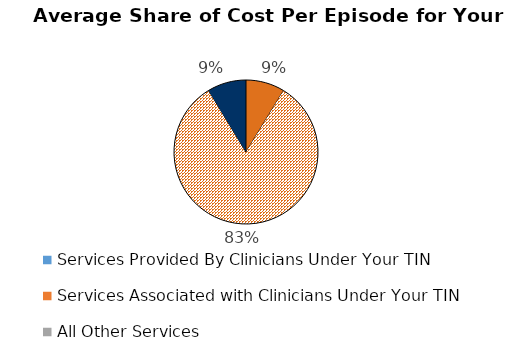
| Category | Series 2 | Series 3 | Series 5 | Series 4 | Series 0 | Series 1 |
|---|---|---|---|---|---|---|
| Services Provided By Clinicians Under Your TIN | 0.087 | 0.092 | 0.095 | 0.087 | 0.092 | 0.095 |
| Services Associated with Clinicians Under Your TIN | 0.826 | 0.797 | 0.812 | 0.826 | 0.797 | 0.812 |
| All Other Services | 0.087 | 0.111 | 0.093 | 0.087 | 0.111 | 0.093 |